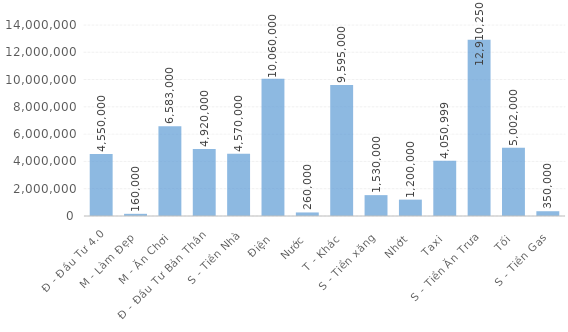
| Category | Total |
|---|---|
| Đ - Đầu Tư 4.0 | 4550000 |
| M - Làm Đẹp | 160000 |
| M - Ăn Chơi | 6583000 |
| Đ - Đầu Tư Bản Thân | 4920000 |
| S - Tiền Nhà, Điện, Nước | 4570000 |
| T - Khác | 10060000 |
| S - Tiền xăng, Nhớt, Taxi | 260000 |
| S - Tiền Ăn Trưa, Tối | 9595000 |
| S - Tiền Gas | 1530000 |
| M - Quần Áo | 1200000 |
| M - Giầy Dép | 4050999 |
| Đ - Đầu Tư Tình Cảm | 12910250 |
| S - Tiền Ăn Sáng | 5002000 |
| S - Mua Sắm Mới | 350000 |